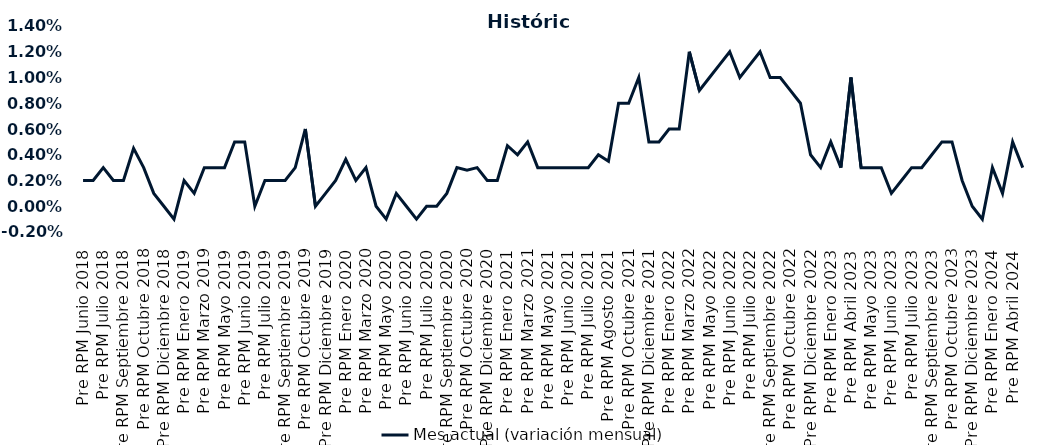
| Category | Mes actual (variación mensual)  |
|---|---|
| Pre RPM Junio 2018 | 0.002 |
| Post RPM Junio 2018 | 0.002 |
| Pre RPM Julio 2018 | 0.003 |
| Post RPM Julio 2018 | 0.002 |
| Pre RPM Septiembre 2018 | 0.002 |
| Post RPM Septiembre 2018 | 0.004 |
| Pre RPM Octubre 2018 | 0.003 |
| Post RPM Octubre 2018 | 0.001 |
| Pre RPM Diciembre 2018 | 0 |
| Post RPM Diciembre 2018 | -0.001 |
| Pre RPM Enero 2019 | 0.002 |
| Post RPM Enero 2019 | 0.001 |
| Pre RPM Marzo 2019 | 0.003 |
| Post RPM Marzo 2019 | 0.003 |
| Pre RPM Mayo 2019 | 0.003 |
| Post RPM Mayo 2019 | 0.005 |
| Pre RPM Junio 2019 | 0.005 |
| Post RPM Junio 2019 | 0 |
| Pre RPM Julio 2019 | 0.002 |
| Post RPM Julio 2019 | 0.002 |
| Pre RPM Septiembre 2019 | 0.002 |
| Post RPM Septiembre 2019 | 0.003 |
| Pre RPM Octubre 2019 | 0.006 |
| Post RPM Octubre 2019 | 0 |
| Pre RPM Diciembre 2019 | 0.001 |
| Post RPM Diciembre 2019 | 0.002 |
| Pre RPM Enero 2020 | 0.004 |
| Post RPM Enero 2020 | 0.002 |
| Pre RPM Marzo 2020 | 0.003 |
| Post RPM Marzo 2020 | 0 |
| Pre RPM Mayo 2020 | -0.001 |
| Post RPM Mayo 2020 | 0.001 |
| Pre RPM Junio 2020 | 0 |
| Post RPM Junio 2020 | -0.001 |
| Pre RPM Julio 2020 | 0 |
| Post RPM Julio 2020 | 0 |
| Pre RPM Septiembre 2020 | 0.001 |
| Post RPM Septiembre 2020 | 0.003 |
| Pre RPM Octubre 2020 | 0.003 |
| Post RPM Octubre 2020 | 0.003 |
| Pre RPM Diciembre 2020 | 0.002 |
| Post RPM Diciembre 2020 | 0.002 |
| Pre RPM Enero 2021 | 0.005 |
| Post RPM Enero 2021 | 0.004 |
| Pre RPM Marzo 2021 | 0.005 |
| Post RPM Marzo 2021 | 0.003 |
| Pre RPM Mayo 2021 | 0.003 |
| Post RPM Mayo 2021 | 0.003 |
| Pre RPM Junio 2021 | 0.003 |
| Post RPM Junio 2021 | 0.003 |
| Pre RPM Julio 2021 | 0.003 |
| Post RPM Julio 2021 | 0.004 |
| Pre RPM Agosto 2021 | 0.004 |
| Post RPM Agosto 2021 | 0.008 |
| Pre RPM Octubre 2021 | 0.008 |
| Post RPM Octubre 2021 | 0.01 |
| Pre RPM Diciembre 2021 | 0.005 |
| Post RPM Diciembre 2021 | 0.005 |
| Pre RPM Enero 2022 | 0.006 |
| Post RPM Enero 2022 | 0.006 |
| Pre RPM Marzo 2022 | 0.012 |
| Post RPM Marzo 2022 | 0.009 |
| Pre RPM Mayo 2022 | 0.01 |
| Post RPM Mayo 2022 | 0.011 |
| Pre RPM Junio 2022 | 0.012 |
| Post RPM Junio 2022 | 0.01 |
| Pre RPM Julio 2022 | 0.011 |
| Post RPM Julio 2022 | 0.012 |
| Pre RPM Septiembre 2022 | 0.01 |
| Post RPM Septiembre 2022 | 0.01 |
| Pre RPM Octubre 2022 | 0.009 |
| Post RPM Octubre 2022 | 0.008 |
| Pre RPM Diciembre 2022 | 0.004 |
| Post RPM Diciembre 2022 | 0.003 |
| Pre RPM Enero 2023 | 0.005 |
| Post RPM Enero 2023 | 0.003 |
| Pre RPM Abril 2023 | 0.01 |
| Post RPM Abril 2023 | 0.003 |
| Pre RPM Mayo 2023 | 0.003 |
| Post RPM Mayo 2023 | 0.003 |
| Pre RPM Junio 2023 | 0.001 |
| Post RPM Junio 2023 | 0.002 |
| Pre RPM Julio 2023 | 0.003 |
| Post RPM Julio 2023 | 0.003 |
| Pre RPM Septiembre 2023 | 0.004 |
| Post RPM Septiembre 2023 | 0.005 |
| Pre RPM Octubre 2023 | 0.005 |
| Post RPM Octubre 2023 | 0.002 |
| Pre RPM Diciembre 2023 | 0 |
| Post RPM Diciembre 2023 | -0.001 |
| Pre RPM Enero 2024 | 0.003 |
| Post RPM Enero 2024 | 0.001 |
| Pre RPM Abril 2024 | 0.005 |
| Post RPM Abril 2024 | 0.003 |